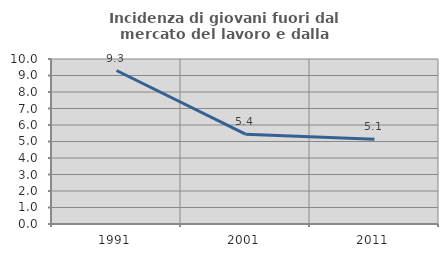
| Category | Incidenza di giovani fuori dal mercato del lavoro e dalla formazione  |
|---|---|
| 1991.0 | 9.302 |
| 2001.0 | 5.442 |
| 2011.0 | 5.137 |